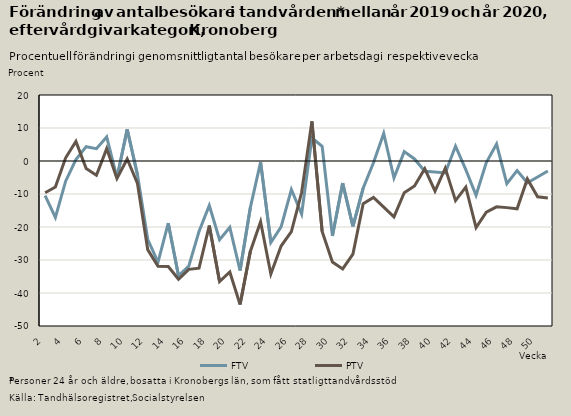
| Category | FTV | PTV |
|---|---|---|
| 2.0 | -10.512 | -9.618 |
| 3.0 | -17.094 | -7.88 |
| 4.0 | -6.108 | 0.97 |
| 5.0 | 0.42 | 5.949 |
| 6.0 | 4.345 | -2.292 |
| 7.0 | 3.738 | -4.331 |
| 8.0 | 7.303 | 3.751 |
| 9.0 | -5.067 | -5.322 |
| 10.0 | 9.567 | 0.604 |
| 11.0 | -4.161 | -6.809 |
| 12.0 | -23.71 | -26.849 |
| 13.0 | -30.71 | -31.924 |
| 14.0 | -18.858 | -31.957 |
| 15.0 | -34.768 | -35.839 |
| 16.0 | -31.872 | -32.823 |
| 17.0 | -21.329 | -32.482 |
| 18.0 | -13.465 | -19.576 |
| 19.0 | -23.844 | -36.517 |
| 20.0 | -20.112 | -33.637 |
| 21.0 | -33.2 | -43.462 |
| 22.0 | -14.134 | -27.392 |
| 23.0 | -0.334 | -18.398 |
| 24.0 | -24.685 | -34.227 |
| 25.0 | -19.983 | -25.781 |
| 26.0 | -8.634 | -21.419 |
| 27.0 | -16.061 | -9.547 |
| 28.0 | 7.039 | 11.975 |
| 29.0 | 4.437 | -21.33 |
| 30.0 | -22.702 | -30.631 |
| 31.0 | -6.713 | -32.697 |
| 32.0 | -19.791 | -28.22 |
| 33.0 | -8.203 | -12.938 |
| 34.0 | -0.524 | -11.059 |
| 35.0 | 8.363 | -13.997 |
| 36.0 | -5.113 | -16.934 |
| 37.0 | 2.853 | -9.612 |
| 38.0 | 0.627 | -7.568 |
| 39.0 | -3.092 | -2.336 |
| 40.0 | -3.357 | -9.091 |
| 41.0 | -3.621 | -2.153 |
| 42.0 | 4.48 | -11.995 |
| 43.0 | -2.621 | -7.91 |
| 44.0 | -10.4 | -20.197 |
| 45.0 | -0.478 | -15.506 |
| 46.0 | 5.133 | -13.9 |
| 47.0 | -6.857 | -14.13 |
| 48.0 | -2.891 | -14.474 |
| 49.0 | -6.604 | -5.425 |
| 50.0 | -4.827 | -10.856 |
| 51.0 | -3.037 | -11.216 |